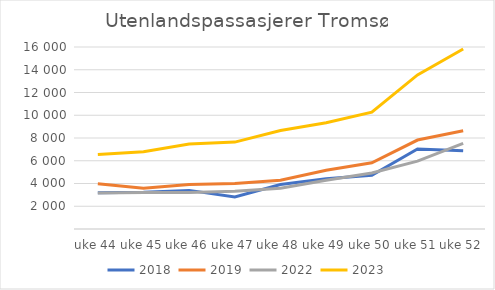
| Category | 2018 | 2019 | 2022 | 2023 |
|---|---|---|---|---|
| uke 44 | 3183 | 3973 | 3172 | 6546 |
| uke 45 | 3233 | 3586 | 3211 | 6783 |
| uke 46 | 3395 | 3903 | 3214 | 7473 |
| uke 47 | 2813 | 4002 | 3315 | 7639 |
| uke 48 | 3916 | 4282 | 3578 | 8661 |
| uke 49 | 4419 | 5159 | 4286 | 9344 |
| uke 50 | 4720 | 5815 | 4930 | 10277 |
| uke 51 | 7042 | 7820 | 5966 | 13550 |
| uke 52 | 6873 | 8631 | 7520 | 15827 |